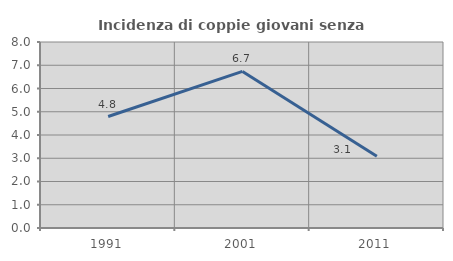
| Category | Incidenza di coppie giovani senza figli |
|---|---|
| 1991.0 | 4.795 |
| 2001.0 | 6.734 |
| 2011.0 | 3.084 |